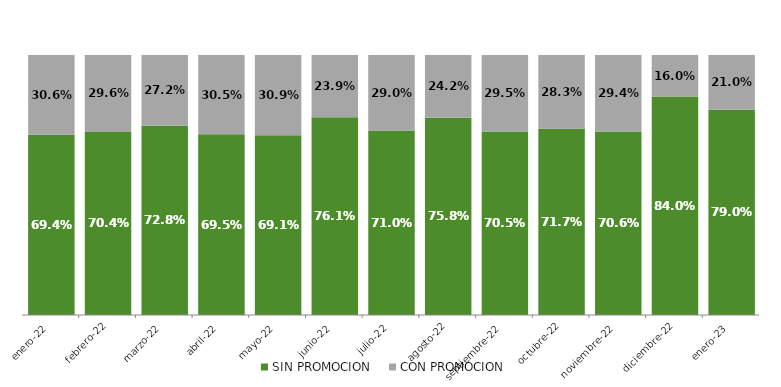
| Category | SIN PROMOCION   | CON PROMOCION   |
|---|---|---|
| 2022-01-01 | 0.694 | 0.306 |
| 2022-02-01 | 0.704 | 0.296 |
| 2022-03-01 | 0.728 | 0.272 |
| 2022-04-01 | 0.695 | 0.305 |
| 2022-05-01 | 0.691 | 0.309 |
| 2022-06-01 | 0.761 | 0.239 |
| 2022-07-01 | 0.71 | 0.29 |
| 2022-08-01 | 0.758 | 0.242 |
| 2022-09-01 | 0.705 | 0.295 |
| 2022-10-01 | 0.717 | 0.283 |
| 2022-11-01 | 0.706 | 0.294 |
| 2022-12-01 | 0.84 | 0.16 |
| 2023-01-01 | 0.79 | 0.21 |